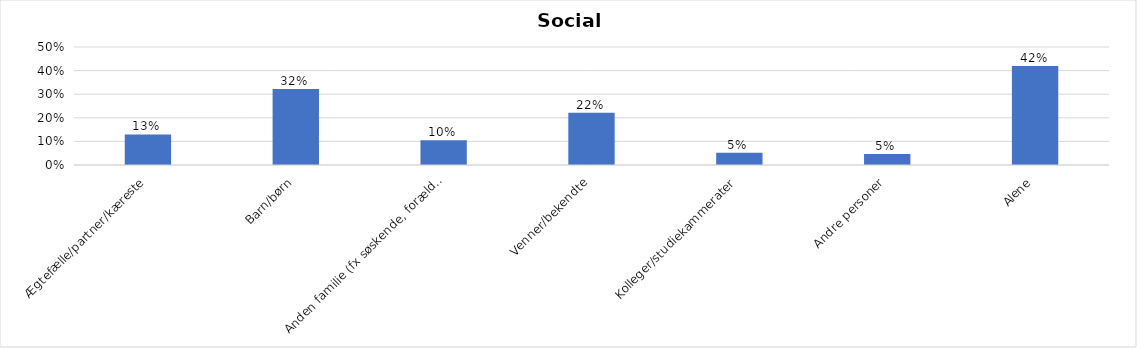
| Category | % |
|---|---|
| Ægtefælle/partner/kæreste | 0.13 |
| Barn/børn | 0.323 |
| Anden familie (fx søskende, forældre) | 0.105 |
| Venner/bekendte | 0.222 |
| Kolleger/studiekammerater | 0.052 |
| Andre personer | 0.047 |
| Alene | 0.42 |